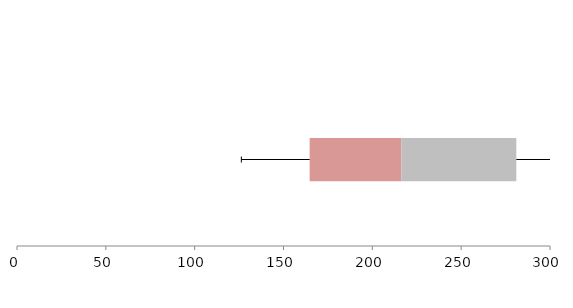
| Category | Series 1 | Series 2 | Series 3 |
|---|---|---|---|
| 0 | 164.727 | 51.622 | 64.689 |